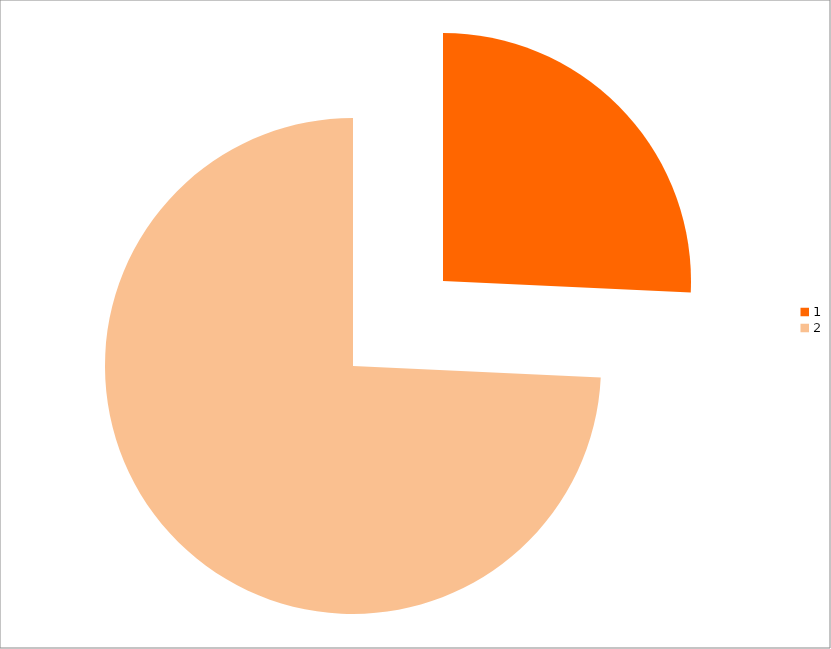
| Category | Series 0 |
|---|---|
| 0 | 113 |
| 1 | 326 |